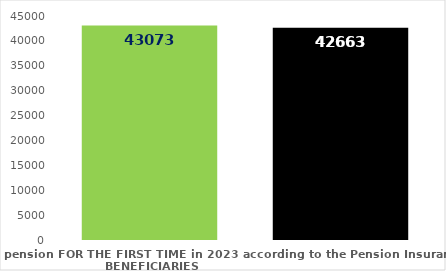
| Category | broj korisnika |
|---|---|
| Pension beneficiaries entitled to pension FOR THE FIRST TIME in 2023 according to the Pension Insurance Act  - NEW BENEFICIARIES | 43073 |
| Pension beneficiaries whose pension entitlement ceased in 2023  -  death caused,   
and who were retired according to the Pension Insurance Act   | 42663 |